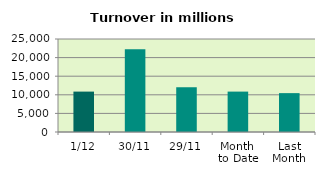
| Category | Series 0 |
|---|---|
| 1/12 | 10860.98 |
| 30/11 | 22252.405 |
| 29/11 | 12022.048 |
| Month 
to Date | 10860.98 |
| Last
Month | 10449.431 |